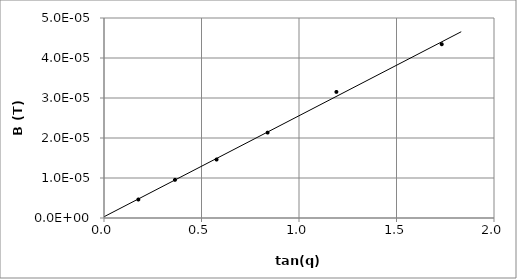
| Category | Series 0 |
|---|---|
| 0.17632682870329697 | 0 |
| 0.3639699003637574 | 0 |
| 0.5773496795031555 | 0 |
| 0.8390986262997705 | 0 |
| 1.1917518085898466 | 0 |
| 1.732047269454573 | 0 |